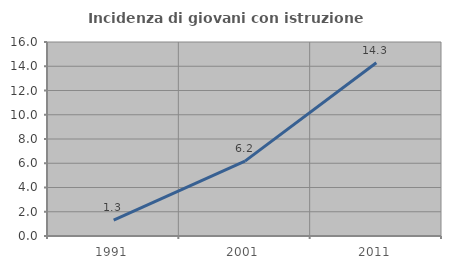
| Category | Incidenza di giovani con istruzione universitaria |
|---|---|
| 1991.0 | 1.304 |
| 2001.0 | 6.178 |
| 2011.0 | 14.286 |